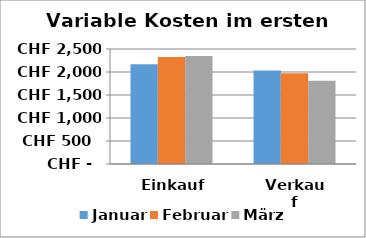
| Category | Januar | Februar | März |
|---|---|---|---|
| Einkauf | 2171 | 2324 | 2348 |
| Verkauf | 2033 | 1975 | 1809 |